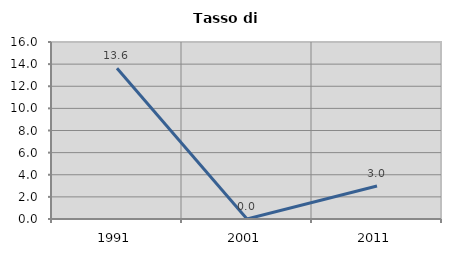
| Category | Tasso di disoccupazione   |
|---|---|
| 1991.0 | 13.636 |
| 2001.0 | 0 |
| 2011.0 | 2.985 |